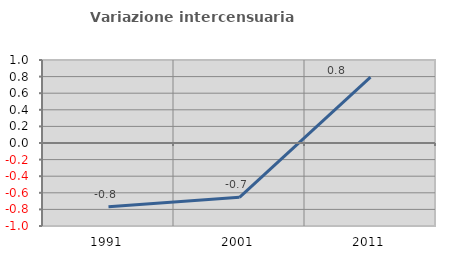
| Category | Variazione intercensuaria annua |
|---|---|
| 1991.0 | -0.769 |
| 2001.0 | -0.654 |
| 2011.0 | 0.793 |